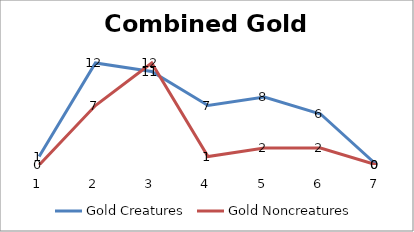
| Category | Gold Creatures | Gold Noncreatures |
|---|---|---|
| 0 | 1 | 0 |
| 1 | 12 | 7 |
| 2 | 11 | 12 |
| 3 | 7 | 1 |
| 4 | 8 | 2 |
| 5 | 6 | 2 |
| 6 | 0 | 0 |